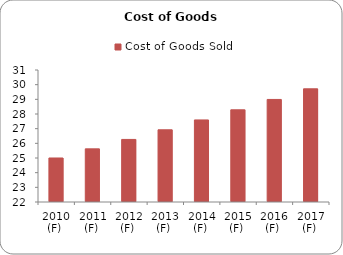
| Category | Cost of Goods Sold |
|---|---|
| 2010 (F)  | 25 |
| 2011 (F)  | 25.625 |
| 2012 (F)  | 26.266 |
| 2013 (F)  | 26.922 |
| 2014 (F)  | 27.595 |
| 2015 (F)  | 28.285 |
| 2016 (F)  | 28.992 |
| 2017 (F)  | 29.717 |